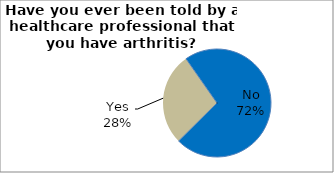
| Category | Series 0 |
|---|---|
| No | 72.304 |
| Yes | 27.696 |